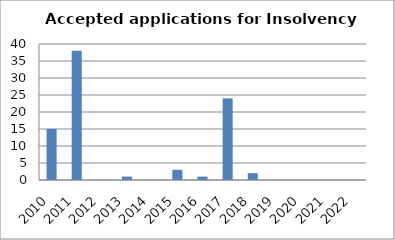
| Category | Series 0 |
|---|---|
| 2010.0 | 15 |
| 2011.0 | 38 |
| 2012.0 | 0 |
| 2013.0 | 1 |
| 2014.0 | 0 |
| 2015.0 | 3 |
| 2016.0 | 1 |
| 2017.0 | 24 |
| 2018.0 | 2 |
| 2019.0 | 0 |
| 2020.0 | 0 |
| 2021.0 | 0 |
| 2022.0 | 0 |